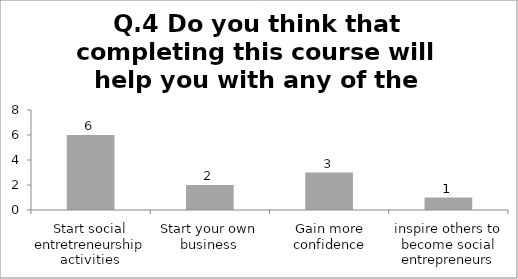
| Category | Q.4 Do you think that completing this course will help you with any of the followoing ? |
|---|---|
| Start social entretreneurship activities | 6 |
| Start your own business | 2 |
| Gain more confidence | 3 |
| inspire others to become social entrepreneurs | 1 |